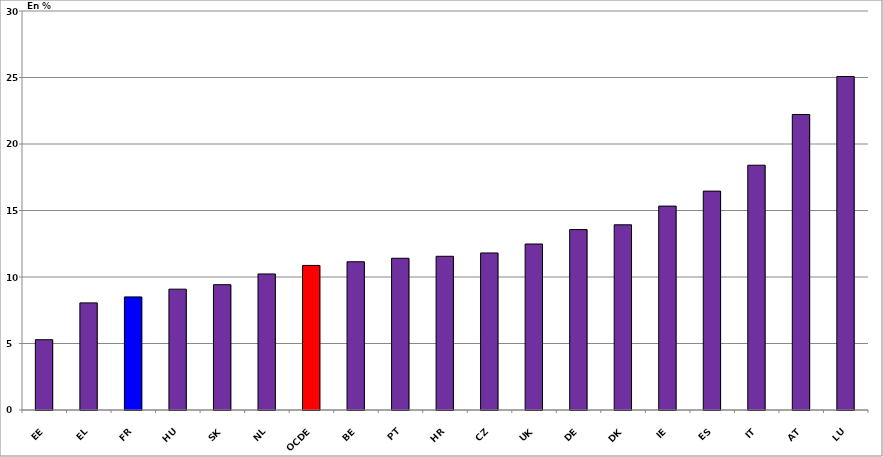
| Category | Series 0 |
|---|---|
| EE | 5.284 |
| EL | 8.054 |
| FR | 8.502 |
| HU | 9.086 |
| SK | 9.422 |
| NL | 10.229 |
| OCDE | 10.87 |
| BE | 11.147 |
| PT | 11.408 |
| HR | 11.558 |
| CZ | 11.807 |
| UK | 12.48 |
| DE | 13.566 |
| DK | 13.924 |
| IE | 15.33 |
| ES | 16.458 |
| IT | 18.405 |
| AT | 22.22 |
| LU | 25.076 |